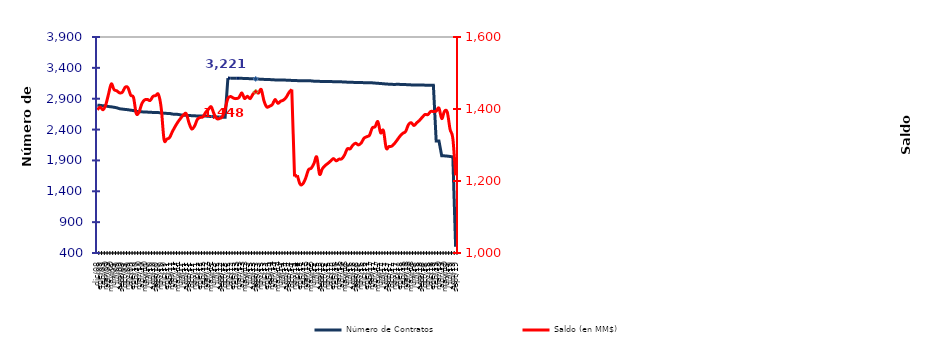
| Category | Número de Contratos |
|---|---|
| 2003-09-01 | 3604 |
| 2003-10-01 | 3646 |
| 2003-11-01 | 3743 |
| 2003-12-01 | 3841 |
| 2004-01-01 | 3830 |
| 2004-02-01 | 3832 |
| 2004-03-01 | 3858 |
| 2004-04-01 | 3858 |
| 2004-05-01 | 3856 |
| 2004-06-01 | 3869 |
| 2004-07-01 | 3833 |
| 2004-08-01 | 3791 |
| 2004-09-01 | 3756 |
| 2004-10-01 | 3714 |
| 2004-11-01 | 3664 |
| 2004-12-01 | 3612 |
| 2005-01-01 | 3574 |
| 2005-02-01 | 3537 |
| 2005-03-01 | 3496 |
| 2005-04-01 | 3465 |
| 2005-05-01 | 3435 |
| 2005-06-01 | 3410 |
| 2005-07-01 | 3386 |
| 2005-08-01 | 3365 |
| 2005-09-01 | 3344 |
| 2005-10-01 | 3324 |
| 2005-11-01 | 3305 |
| 2005-12-01 | 3284 |
| 2006-01-01 | 3262 |
| 2006-02-01 | 3229 |
| 2006-03-01 | 3212 |
| 2006-04-01 | 3193 |
| 2006-05-01 | 3162 |
| 2006-06-01 | 3147 |
| 2006-07-01 | 3124 |
| 2006-08-01 | 3100 |
| 2006-09-01 | 3082 |
| 2006-10-01 | 3063 |
| 2006-11-01 | 3044 |
| 2006-12-01 | 3027 |
| 2007-01-01 | 3016 |
| 2007-02-01 | 3009 |
| 2007-03-01 | 2978 |
| 2007-04-01 | 2969 |
| 2007-05-01 | 2963 |
| 2007-06-01 | 2950 |
| 2007-07-01 | 2942 |
| 2007-08-01 | 2937 |
| 2007-09-01 | 2927 |
| 2007-10-01 | 2918 |
| 2007-11-01 | 2902 |
| 2007-12-01 | 2893 |
| 2008-01-01 | 2880 |
| 2008-02-01 | 2871 |
| 2008-03-01 | 2866 |
| 2008-04-01 | 2860 |
| 2008-05-01 | 2854 |
| 2008-06-01 | 2847 |
| 2008-07-01 | 2836 |
| 2008-08-01 | 2829 |
| 2008-09-01 | 2825 |
| 2008-10-01 | 2817 |
| 2008-11-01 | 2813 |
| 2008-12-01 | 2795 |
| 2009-01-01 | 2792 |
| 2009-02-01 | 2786 |
| 2009-03-01 | 2783 |
| 2009-04-01 | 2773 |
| 2009-05-01 | 2769 |
| 2009-06-01 | 2761 |
| 2009-07-01 | 2753 |
| 2009-08-01 | 2737 |
| 2009-09-01 | 2732 |
| 2009-10-01 | 2726 |
| 2009-11-01 | 2722 |
| 2009-12-01 | 2714 |
| 2010-01-01 | 2708 |
| 2010-02-01 | 2696 |
| 2010-03-01 | 2690 |
| 2010-04-01 | 2688 |
| 2010-05-01 | 2683 |
| 2010-06-01 | 2683 |
| 2010-07-01 | 2680 |
| 2010-08-01 | 2678 |
| 2010-09-01 | 2676 |
| 2010-10-01 | 2675 |
| 2010-11-01 | 2671 |
| 2010-12-01 | 2665 |
| 2011-01-01 | 2662 |
| 2011-02-01 | 2662 |
| 2011-03-01 | 2651 |
| 2011-04-01 | 2648 |
| 2011-05-01 | 2646 |
| 2011-06-01 | 2638 |
| 2011-07-01 | 2634 |
| 2011-08-01 | 2630 |
| 2011-09-01 | 2628 |
| 2011-10-01 | 2625 |
| 2011-11-01 | 2623 |
| 2011-12-01 | 2620 |
| 2012-01-01 | 2620 |
| 2012-02-01 | 2619 |
| 2012-03-01 | 2619 |
| 2012-04-01 | 2615 |
| 2012-05-01 | 2612 |
| 2012-06-01 | 2609 |
| 2012-07-02 | 2605 |
| 2012-08-03 | 2603 |
| 2012-09-04 | 2601 |
| 2012-10-06 | 2601 |
| 2012-11-07 | 3235 |
| 2012-12-09 | 3232 |
| 2013-01-01 | 3232 |
| 2013-02-01 | 3231 |
| 2013-03-01 | 3230 |
| 2013-04-01 | 3230 |
| 2013-05-01 | 3228 |
| 2013-06-01 | 3227 |
| 2013-07-01 | 3224 |
| 2013-08-01 | 3222 |
| 2013-09-01 | 3221 |
| 2013-10-01 | 3218 |
| 2013-11-01 | 3216 |
| 2013-12-01 | 3213 |
| 2014-01-01 | 3212 |
| 2014-02-01 | 3211 |
| 2014-03-01 | 3206 |
| 2014-04-01 | 3205 |
| 2014-05-01 | 3203 |
| 2014-06-01 | 3202 |
| 2014-07-01 | 3202 |
| 2014-08-01 | 3201 |
| 2014-09-01 | 3200 |
| 2014-10-01 | 3196 |
| 2014-11-01 | 3195 |
| 2014-12-01 | 3193 |
| 2015-01-01 | 3193 |
| 2015-02-01 | 3193 |
| 2015-03-01 | 3193 |
| 2015-04-01 | 3192 |
| 2015-05-01 | 3189 |
| 2015-06-01 | 3184 |
| 2015-07-01 | 3182 |
| 2015-08-01 | 3181 |
| 2015-09-01 | 3180 |
| 2015-10-01 | 3179 |
| 2015-11-01 | 3179 |
| 2015-12-01 | 3178 |
| 2016-01-01 | 3176 |
| 2016-02-01 | 3175 |
| 2016-03-01 | 3174 |
| 2016-04-01 | 3173 |
| 2016-05-01 | 3171 |
| 2016-06-01 | 3168 |
| 2016-07-01 | 3165 |
| 2016-08-01 | 3165 |
| 2016-09-01 | 3164 |
| 2016-10-01 | 3163 |
| 2016-11-01 | 3162 |
| 2016-12-01 | 3160 |
| 2017-01-01 | 3160 |
| 2017-02-01 | 3158 |
| 2017-03-01 | 3157 |
| 2017-04-01 | 3153 |
| 2017-05-01 | 3150 |
| 2017-06-01 | 3146 |
| 2017-07-01 | 3143 |
| 2017-08-01 | 3137 |
| 2017-09-01 | 3136 |
| 2017-10-01 | 3133 |
| 2017-11-01 | 3131 |
| 2017-12-01 | 3134 |
| 2018-01-01 | 3132 |
| 2018-02-01 | 3130 |
| 2018-03-01 | 3129 |
| 2018-04-01 | 3126 |
| 2018-05-01 | 3124 |
| 2018-06-01 | 3123 |
| 2018-07-01 | 3121 |
| 2018-08-01 | 3121 |
| 2018-09-01 | 3121 |
| 2018-10-01 | 3120 |
| 2018-11-01 | 3118 |
| 2018-12-01 | 3118 |
| 2019-01-01 | 3117 |
| 2019-02-01 | 2216 |
| 2019-03-01 | 2216 |
| 2019-04-01 | 1974 |
| 2019-05-01 | 1974 |
| 2019-06-01 | 1970 |
| 2019-07-01 | 1964 |
| 2019-08-01 | 1957 |
| 2019-09-01 | 503 |